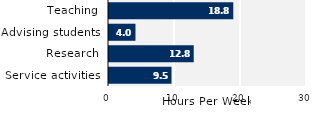
| Category | Series 0 |
|---|---|
| Service activities | 9.471 |
| Research | 12.836 |
| Advising students | 4.011 |
| Teaching | 18.831 |